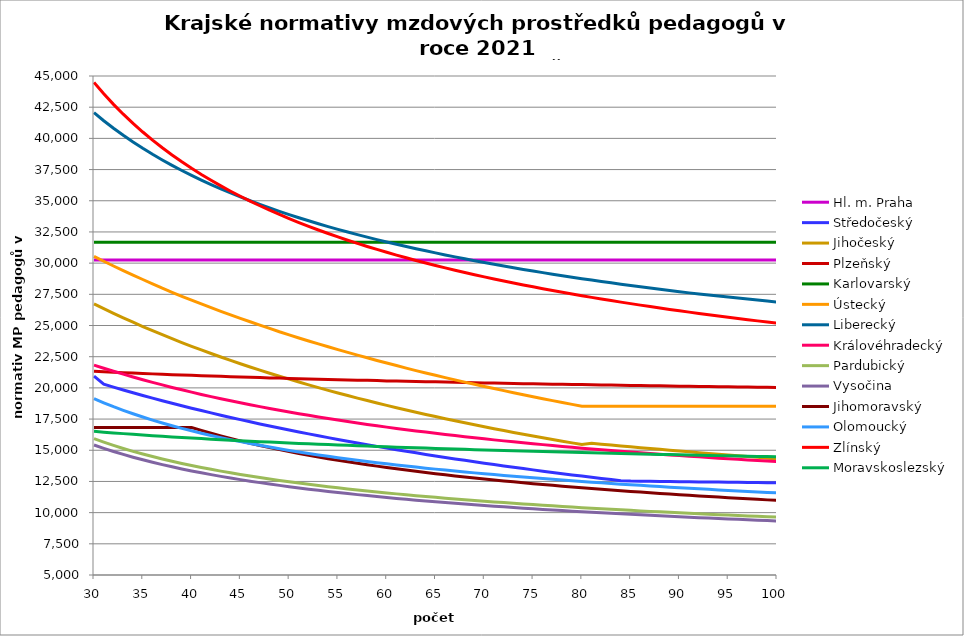
| Category | Hl. m. Praha | Středočeský | Jihočeský | Plzeňský | Karlovarský  | Ústecký   | Liberecký | Královéhradecký | Pardubický | Vysočina | Jihomoravský | Olomoucký | Zlínský | Moravskoslezský |
|---|---|---|---|---|---|---|---|---|---|---|---|---|---|---|
| 30.0 | 30242.815 | 20944.32 | 26736.756 | 21332.583 | 31680 | 30538.495 | 42057.097 | 21823.171 | 15925.45 | 15423.106 | 16823.804 | 19136.743 | 44483.034 | 16514.397 |
| 31.0 | 30242.815 | 20294.884 | 26352.328 | 21295.724 | 31680 | 30149.469 | 41416.635 | 21569.522 | 15648.029 | 15154.147 | 16823.804 | 18803.865 | 43573.78 | 16451.333 |
| 32.0 | 30242.815 | 20061.609 | 25978.799 | 21258.991 | 31680 | 29770.231 | 40814.827 | 21330.779 | 15387.974 | 14901.907 | 16823.804 | 18489.396 | 42728.127 | 16390.729 |
| 33.0 | 30242.815 | 19833.636 | 25615.71 | 21222.385 | 31680 | 29400.414 | 40247.996 | 21097.263 | 15144.04 | 14665.617 | 16823.804 | 18198.878 | 41939.245 | 16332.414 |
| 34.0 | 30242.815 | 19610.787 | 25262.631 | 21185.905 | 31680 | 29039.673 | 39712.935 | 20868.805 | 14914.668 | 14443.334 | 16823.804 | 17923.95 | 41201.264 | 16276.236 |
| 35.0 | 30242.815 | 19392.889 | 24919.153 | 21158.627 | 31680 | 28687.677 | 39206.825 | 20653.751 | 14698.498 | 14234.129 | 16823.804 | 17663.617 | 40509.112 | 16222.055 |
| 36.0 | 30242.815 | 19179.78 | 24584.89 | 21122.365 | 31680 | 28344.112 | 38727.182 | 20443.084 | 14494.338 | 14036.769 | 16823.804 | 17416.971 | 39858.384 | 16169.744 |
| 37.0 | 30242.815 | 18971.304 | 24259.475 | 21095.25 | 31680 | 27990.276 | 38271.808 | 20236.672 | 14301.141 | 13849.381 | 16823.804 | 17183.186 | 39245.232 | 16119.19 |
| 38.0 | 30242.815 | 18767.312 | 23942.563 | 21059.205 | 31680 | 27663.117 | 37838.746 | 20034.386 | 14117.979 | 13672.128 | 16823.804 | 16961.506 | 38666.283 | 16070.287 |
| 39.0 | 30242.815 | 18567.66 | 23633.824 | 21032.253 | 31680 | 27343.517 | 37426.253 | 19843.96 | 13944.029 | 13503.704 | 16823.804 | 16757.01 | 38118.562 | 16022.938 |
| 40.0 | 30242.815 | 18372.211 | 23332.946 | 21005.369 | 31680 | 27031.218 | 37032.767 | 19657.12 | 13778.56 | 13343.623 | 16823.804 | 16557.386 | 37599.438 | 15977.056 |
| 41.0 | 30242.815 | 18180.833 | 23039.632 | 20978.553 | 31680 | 26725.972 | 36656.888 | 19473.766 | 13620.917 | 13190.751 | 16588.753 | 16367.968 | 37106.576 | 15932.56 |
| 42.0 | 30242.815 | 17993.402 | 22753.601 | 20951.806 | 31680 | 26427.543 | 36297.351 | 19301.233 | 13470.513 | 13045.061 | 16360.179 | 16188.22 | 36637.891 | 15889.374 |
| 43.0 | 30242.815 | 17809.796 | 22474.586 | 20925.127 | 31680 | 26135.706 | 35953.016 | 19131.73 | 13326.818 | 12905.864 | 16148.793 | 16012.377 | 36191.52 | 15847.43 |
| 44.0 | 30242.815 | 17629.899 | 22202.33 | 20898.516 | 31680 | 25850.243 | 35622.849 | 18965.178 | 13189.358 | 12772.847 | 15942.8 | 15845.472 | 35765.793 | 15806.663 |
| 45.0 | 30242.815 | 17453.6 | 21936.591 | 20871.973 | 31680 | 25570.948 | 35305.911 | 18801.501 | 13057.7 | 12645.405 | 15747.215 | 15692.129 | 35359.204 | 15767.015 |
| 46.0 | 30242.815 | 17280.792 | 21677.138 | 20854.315 | 31680 | 25297.625 | 35001.347 | 18647.562 | 12931.454 | 12522.973 | 15561.468 | 15536.761 | 34970.396 | 15728.43 |
| 47.0 | 30242.815 | 17111.373 | 21423.751 | 20827.883 | 31680 | 25030.082 | 34708.378 | 18496.124 | 12810.264 | 12405.947 | 15385.034 | 15394.177 | 34598.138 | 15690.857 |
| 48.0 | 30242.815 | 16945.243 | 21176.219 | 20801.519 | 31680 | 24768.14 | 34426.288 | 18347.126 | 12693.805 | 12292.89 | 15212.556 | 15254.186 | 34241.315 | 15654.249 |
| 49.0 | 30242.815 | 16782.308 | 20934.342 | 20783.98 | 31680 | 24497.527 | 34154.425 | 18207.122 | 12581.783 | 12184.53 | 15048.669 | 15116.718 | 33898.913 | 15618.561 |
| 50.0 | 30242.815 | 16622.476 | 20697.928 | 20757.726 | 31680 | 24246.557 | 33892.187 | 18062.725 | 12473.925 | 12079.804 | 14892.944 | 14986.322 | 33570.006 | 15583.751 |
| 51.0 | 30242.815 | 16465.66 | 20466.794 | 20740.261 | 31680 | 24000.676 | 33639.02 | 17927.013 | 12369.982 | 11979.429 | 14744.986 | 14862.695 | 33253.748 | 15549.781 |
| 52.0 | 30242.815 | 16311.776 | 20240.765 | 20714.118 | 31680 | 23759.732 | 33394.416 | 17799.645 | 12269.727 | 11882.111 | 14599.939 | 14741.091 | 32949.364 | 15516.614 |
| 53.0 | 30242.815 | 16160.741 | 20019.674 | 20696.725 | 31680 | 23523.578 | 33157.904 | 17667.842 | 12172.947 | 11788.571 | 14462.119 | 14625.857 | 32656.145 | 15484.216 |
| 54.0 | 30242.815 | 16012.477 | 19803.361 | 20679.362 | 31680 | 23292.072 | 32929.046 | 17544.118 | 12079.45 | 11698.124 | 14326.878 | 14512.411 | 32373.436 | 15452.555 |
| 55.0 | 30242.815 | 15866.909 | 19591.673 | 20653.372 | 31680 | 23065.079 | 32707.44 | 17422.114 | 11989.055 | 11610.393 | 14198.386 | 14404.975 | 32100.636 | 15421.601 |
| 56.0 | 30242.815 | 15723.964 | 19384.462 | 20636.082 | 31680 | 22842.466 | 32492.711 | 17301.796 | 11901.595 | 11525.553 | 14072.178 | 14299.118 | 31837.188 | 15391.324 |
| 57.0 | 30242.815 | 15583.571 | 19181.588 | 20618.821 | 31680 | 22624.11 | 32284.51 | 17189.022 | 11816.917 | 11443.504 | 13952.291 | 14198.949 | 31582.58 | 15361.7 |
| 58.0 | 30242.815 | 15445.664 | 18982.917 | 20601.588 | 31680 | 22409.89 | 32082.513 | 17071.891 | 11734.878 | 11364.413 | 13838.462 | 14100.174 | 31336.336 | 15332.701 |
| 59.0 | 30242.815 | 15310.175 | 18788.32 | 20584.384 | 31680 | 22199.687 | 31886.417 | 16962.085 | 11655.343 | 11287.419 | 13726.474 | 14002.763 | 31098.015 | 15304.305 |
| 60.0 | 30242.815 | 15177.043 | 18597.671 | 20558.632 | 31680 | 21993.392 | 31695.94 | 16853.683 | 11578.189 | 11212.462 | 13616.284 | 13910.666 | 30867.208 | 15276.488 |
| 61.0 | 30242.815 | 15046.207 | 18410.853 | 20541.5 | 31680 | 21790.895 | 31510.818 | 16752.257 | 11503.301 | 11139.973 | 13511.693 | 13823.7 | 30643.533 | 15249.229 |
| 62.0 | 30242.815 | 14917.607 | 18227.75 | 20524.396 | 31680 | 21581.155 | 31330.804 | 16652.044 | 11430.569 | 11069.876 | 13412.482 | 13733.936 | 30426.635 | 15222.509 |
| 63.0 | 30242.815 | 14791.186 | 18048.254 | 20507.321 | 31680 | 21386.145 | 31155.667 | 16547.556 | 11359.894 | 11000.896 | 13310.987 | 13649.158 | 30216.185 | 15196.307 |
| 64.0 | 30242.815 | 14666.891 | 17872.258 | 20490.274 | 31680 | 21194.627 | 30985.19 | 16455.172 | 11291.179 | 10934.434 | 13218.369 | 13565.421 | 30011.873 | 15170.606 |
| 65.0 | 30242.815 | 14544.667 | 17699.662 | 20481.762 | 31680 | 21006.509 | 30819.169 | 16358.472 | 11224.338 | 10869.945 | 13123.404 | 13486.443 | 29813.409 | 15145.388 |
| 66.0 | 30242.815 | 14424.463 | 17530.368 | 20464.757 | 31680 | 20821.701 | 30657.412 | 16262.902 | 11159.286 | 10806.908 | 13033.37 | 13408.379 | 29620.524 | 15120.637 |
| 67.0 | 30242.815 | 14306.23 | 17364.281 | 20447.781 | 31680 | 20640.116 | 30499.738 | 16173.66 | 11095.944 | 10745.515 | 12944.563 | 13331.214 | 29432.964 | 15096.337 |
| 68.0 | 30242.815 | 14189.919 | 17201.312 | 20430.833 | 31680 | 20461.671 | 30345.979 | 16085.393 | 11034.241 | 10685.724 | 12860.439 | 13258.545 | 29250.492 | 15072.473 |
| 69.0 | 30242.815 | 14075.484 | 17041.373 | 20413.913 | 31680 | 20286.286 | 30195.974 | 15998.084 | 10974.106 | 10627.492 | 12777.401 | 13186.663 | 29072.882 | 15049.031 |
| 70.0 | 30242.815 | 13962.88 | 16884.381 | 20397.021 | 31680 | 20113.881 | 30049.571 | 15916.773 | 10915.474 | 10570.78 | 12698.824 | 13115.557 | 28899.927 | 15025.998 |
| 71.0 | 30242.815 | 13852.063 | 16730.256 | 20388.586 | 31680 | 19944.382 | 29906.627 | 15831.28 | 10858.284 | 10515.329 | 12617.853 | 13048.712 | 28731.427 | 15003.361 |
| 72.0 | 30242.815 | 13742.992 | 16578.919 | 20371.736 | 31680 | 19777.716 | 29767.009 | 15751.65 | 10802.478 | 10461.327 | 12541.22 | 12979.082 | 28567.197 | 14981.107 |
| 73.0 | 30242.815 | 13635.625 | 16430.295 | 20354.913 | 31680 | 19613.812 | 29630.587 | 15672.818 | 10748.001 | 10408.738 | 12468.784 | 12913.618 | 28407.061 | 14959.224 |
| 74.0 | 30242.815 | 13529.922 | 16284.312 | 20338.119 | 31680 | 19443.724 | 29497.241 | 15599.626 | 10694.8 | 10356.888 | 12393.946 | 12852.206 | 28250.853 | 14937.702 |
| 75.0 | 30242.815 | 13425.846 | 16140.9 | 20329.732 | 31680 | 19285.287 | 29366.855 | 15522.305 | 10642.827 | 10306.608 | 12323.197 | 12788.013 | 28098.416 | 14916.529 |
| 76.0 | 30242.815 | 13323.359 | 15999.993 | 20312.979 | 31680 | 19129.412 | 29239.322 | 15450.509 | 10592.035 | 10257.65 | 12256.413 | 12727.786 | 27949.602 | 14895.695 |
| 77.0 | 30242.815 | 13222.424 | 15861.524 | 20296.254 | 31680 | 18976.036 | 29114.537 | 15379.374 | 10542.38 | 10209.362 | 12187.221 | 12668.125 | 27804.271 | 14875.191 |
| 78.0 | 30242.815 | 13123.008 | 15725.431 | 20287.901 | 31680 | 18825.099 | 28992.402 | 15308.891 | 10493.821 | 10162.348 | 12121.899 | 12609.02 | 27662.289 | 14855.007 |
| 79.0 | 30242.815 | 13025.075 | 15591.654 | 20271.217 | 31680 | 18676.545 | 28872.825 | 15239.051 | 10446.317 | 10116.374 | 12057.273 | 12550.464 | 27523.532 | 14835.133 |
| 80.0 | 30242.815 | 12928.593 | 15460.134 | 20262.885 | 31680 | 18530.318 | 28755.715 | 15169.846 | 10399.83 | 10071.622 | 11996.363 | 12495.659 | 27387.88 | 14815.562 |
| 81.0 | 30242.815 | 12833.529 | 15556.863 | 20246.242 | 31680 | 18530.318 | 28640.99 | 15105.819 | 10354.326 | 10027.263 | 11933.065 | 12441.33 | 27255.218 | 14796.284 |
| 82.0 | 30242.815 | 12739.854 | 15485.663 | 20237.931 | 31680 | 18530.318 | 28528.566 | 15042.33 | 10309.768 | 9984.086 | 11873.4 | 12387.471 | 27125.44 | 14777.292 |
| 83.0 | 30242.815 | 12647.536 | 15415.112 | 20221.329 | 31680 | 18530.318 | 28418.369 | 14979.372 | 10266.126 | 9941.868 | 11814.328 | 12334.077 | 26998.443 | 14758.578 |
| 84.0 | 30242.815 | 12556.547 | 15345.2 | 20213.038 | 31680 | 18530.318 | 28310.325 | 14916.94 | 10223.368 | 9900.59 | 11758.752 | 12284.242 | 26874.13 | 14740.134 |
| 85.0 | 30242.815 | 12526.507 | 15275.92 | 20196.477 | 31680 | 18530.318 | 28204.363 | 14855.025 | 10181.465 | 9859.847 | 11700.813 | 12234.809 | 26752.407 | 14721.954 |
| 86.0 | 30242.815 | 12517.523 | 15207.263 | 20188.206 | 31680 | 18530.318 | 28100.417 | 14797.992 | 10140.388 | 9820.205 | 11646.297 | 12185.772 | 26633.186 | 14704.031 |
| 87.0 | 30242.815 | 12508.552 | 15139.22 | 20171.686 | 31680 | 18530.318 | 27998.423 | 14737.059 | 10100.11 | 9781.07 | 11592.287 | 12137.126 | 26516.383 | 14686.358 |
| 88.0 | 30242.815 | 12499.594 | 15071.783 | 20163.436 | 31680 | 18530.318 | 27898.32 | 14680.926 | 10060.605 | 9742.811 | 11538.776 | 12088.867 | 26401.918 | 14668.928 |
| 89.0 | 30242.815 | 12490.649 | 15004.944 | 20146.955 | 31680 | 18530.318 | 27800.049 | 14625.219 | 10021.85 | 9705.413 | 11488.534 | 12040.99 | 26289.714 | 14651.736 |
| 90.0 | 30242.815 | 12481.716 | 14938.696 | 20138.725 | 31680 | 18530.318 | 27703.554 | 14574.171 | 9983.82 | 9668.672 | 11438.728 | 11996.449 | 26179.697 | 14634.776 |
| 91.0 | 30242.815 | 12472.797 | 14873.03 | 20130.502 | 31680 | 18530.318 | 27615.404 | 14519.27 | 9946.493 | 9632.208 | 11386.622 | 11952.236 | 26071.798 | 14618.042 |
| 92.0 | 30242.815 | 12463.89 | 14807.939 | 20114.076 | 31680 | 18530.318 | 27528.768 | 14468.958 | 9909.848 | 9596.75 | 11340.401 | 11908.348 | 25965.949 | 14601.528 |
| 93.0 | 30242.815 | 12454.995 | 14743.414 | 20105.873 | 31680 | 18530.318 | 27443.601 | 14414.845 | 9873.864 | 9562.097 | 11291.869 | 11864.78 | 25862.087 | 14585.229 |
| 94.0 | 30242.815 | 12446.114 | 14679.45 | 20097.676 | 31680 | 18530.318 | 27359.862 | 14365.252 | 9838.52 | 9527.875 | 11243.75 | 11821.531 | 25760.15 | 14569.141 |
| 95.0 | 30242.815 | 12437.245 | 14616.039 | 20081.303 | 31680 | 18530.318 | 27277.51 | 14316 | 9803.799 | 9494.254 | 11198.68 | 11778.596 | 25660.08 | 14553.257 |
| 96.0 | 30242.815 | 12428.388 | 14553.173 | 20073.127 | 31680 | 18530.318 | 27196.508 | 14271.148 | 9769.682 | 9461.226 | 11153.969 | 11738.803 | 25561.82 | 14537.574 |
| 97.0 | 30242.815 | 12419.545 | 14490.845 | 20064.957 | 31680 | 18530.318 | 27116.817 | 14222.538 | 9736.151 | 9428.78 | 11109.614 | 11699.278 | 25465.316 | 14522.087 |
| 98.0 | 30242.815 | 12410.713 | 14429.049 | 20048.638 | 31680 | 18530.318 | 27038.402 | 14178.268 | 9703.19 | 9396.732 | 11065.61 | 11660.019 | 25370.517 | 14506.791 |
| 99.0 | 30242.815 | 12401.895 | 14367.778 | 20040.488 | 31680 | 18530.318 | 26961.228 | 14130.288 | 9670.783 | 9365.249 | 11021.954 | 11621.022 | 25277.373 | 14491.682 |
| 100.0 | 30242.815 | 12393.089 | 14307.025 | 20032.345 | 31680 | 18530.318 | 26885.263 | 14086.59 | 9638.914 | 9334.496 | 10981.179 | 11582.286 | 25185.836 | 14476.756 |